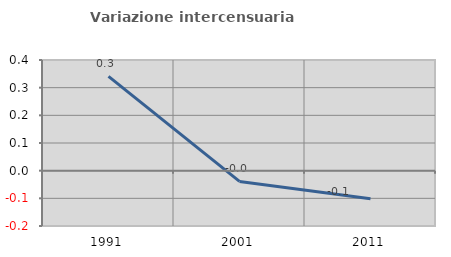
| Category | Variazione intercensuaria annua |
|---|---|
| 1991.0 | 0.341 |
| 2001.0 | -0.039 |
| 2011.0 | -0.101 |